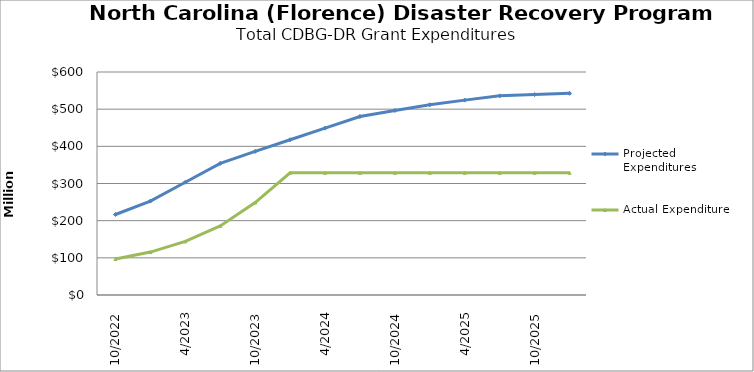
| Category | Projected Expenditures | Actual Expenditure |
|---|---|---|
| 10/2022 | 216539624 | 97038031.57 |
| 1/2023 | 252635178 | 115470991.82 |
| 4/2023 | 303343340 | 144044662.26 |
| 7/2023 | 354051503 | 185767599.96 |
| 10/2023 | 386313634 | 248673756.69 |
| 1/2024 | 417715425 | 328651442.08 |
| 4/2024 | 448977556 | 328651442.08 |
| 7/2024 | 480239687 | 328651442.08 |
| 10/2024 | 496579108 | 328651442.08 |
| 1/2025 | 511833241 | 328651442.08 |
| 4/2025 | 524300594 | 328651442.08 |
| 7/2025 | 535841507 | 328651442.08 |
| 10/2025 | 539242750 | 328651442.08 |
| 1/2026 | 542644000 | 328651442.08 |